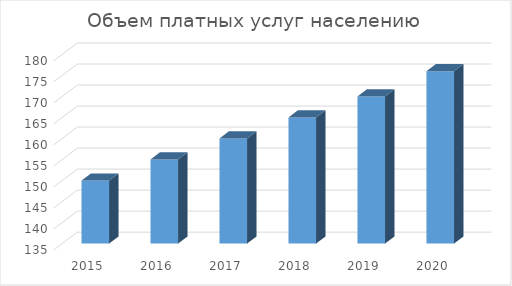
| Category | Объем платных услуг населению |
|---|---|
| 2015.0 | 150 |
| 2016.0 | 155 |
| 2017.0 | 160 |
| 2018.0 | 165 |
| 2019.0 | 170 |
| 2020.0 | 176 |